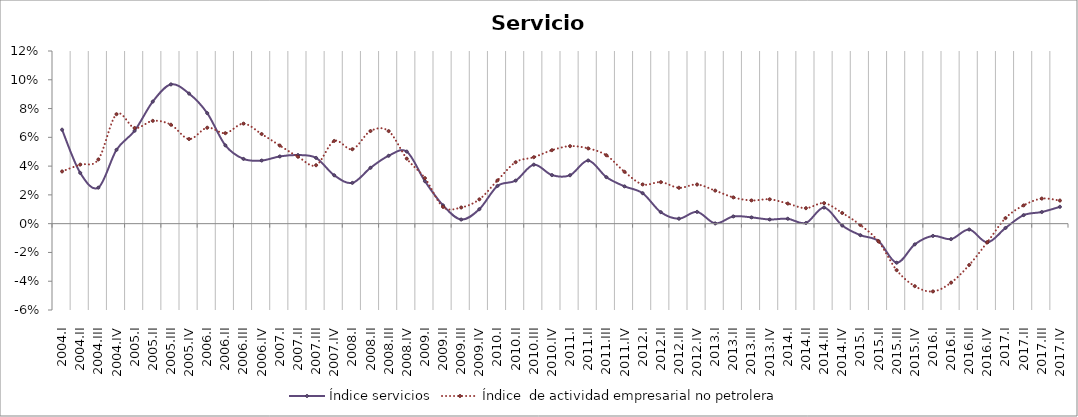
| Category | Índice servicios | Índice  de actividad empresarial no petrolera |
|---|---|---|
| 2004.I | 0.065 | 0.036 |
| 2004.II | 0.035 | 0.041 |
| 2004.III | 0.025 | 0.045 |
| 2004.IV | 0.051 | 0.076 |
| 2005.I | 0.065 | 0.066 |
| 2005.II | 0.085 | 0.071 |
| 2005.III | 0.097 | 0.069 |
| 2005.IV | 0.09 | 0.059 |
| 2006.I | 0.077 | 0.067 |
| 2006.II | 0.054 | 0.063 |
| 2006.III | 0.045 | 0.07 |
| 2006.IV | 0.044 | 0.062 |
| 2007.I | 0.047 | 0.054 |
| 2007.II | 0.048 | 0.047 |
| 2007.III | 0.046 | 0.041 |
| 2007.IV | 0.034 | 0.057 |
| 2008.I | 0.028 | 0.052 |
| 2008.II | 0.039 | 0.064 |
| 2008.III | 0.047 | 0.064 |
| 2008.IV | 0.05 | 0.045 |
| 2009.I | 0.03 | 0.032 |
| 2009.II | 0.013 | 0.012 |
| 2009.III | 0.003 | 0.011 |
| 2009.IV | 0.01 | 0.017 |
| 2010.I | 0.026 | 0.03 |
| 2010.II | 0.03 | 0.043 |
| 2010.III | 0.041 | 0.046 |
| 2010.IV | 0.034 | 0.051 |
| 2011.I | 0.034 | 0.054 |
| 2011.II | 0.044 | 0.052 |
| 2011.III | 0.032 | 0.048 |
| 2011.IV | 0.026 | 0.036 |
| 2012.I | 0.021 | 0.027 |
| 2012.II | 0.008 | 0.029 |
| 2012.III | 0.003 | 0.025 |
| 2012.IV | 0.008 | 0.027 |
| 2013.I | 0 | 0.023 |
| 2013.II | 0.005 | 0.018 |
| 2013.III | 0.004 | 0.016 |
| 2013.IV | 0.003 | 0.017 |
| 2014.I | 0.003 | 0.014 |
| 2014.II | 0 | 0.011 |
| 2014.III | 0.011 | 0.014 |
| 2014.IV | -0.001 | 0.007 |
| 2015.I | -0.008 | -0.001 |
| 2015.II | -0.012 | -0.012 |
| 2015.III | -0.027 | -0.032 |
| 2015.IV | -0.014 | -0.043 |
| 2016.I | -0.009 | -0.047 |
| 2016.II | -0.011 | -0.041 |
| 2016.III | -0.004 | -0.029 |
| 2016.IV | -0.013 | -0.013 |
| 2017.I | -0.003 | 0.004 |
| 2017.II | 0.006 | 0.013 |
| 2017.III | 0.008 | 0.017 |
| 2017.IV | 0.012 | 0.016 |